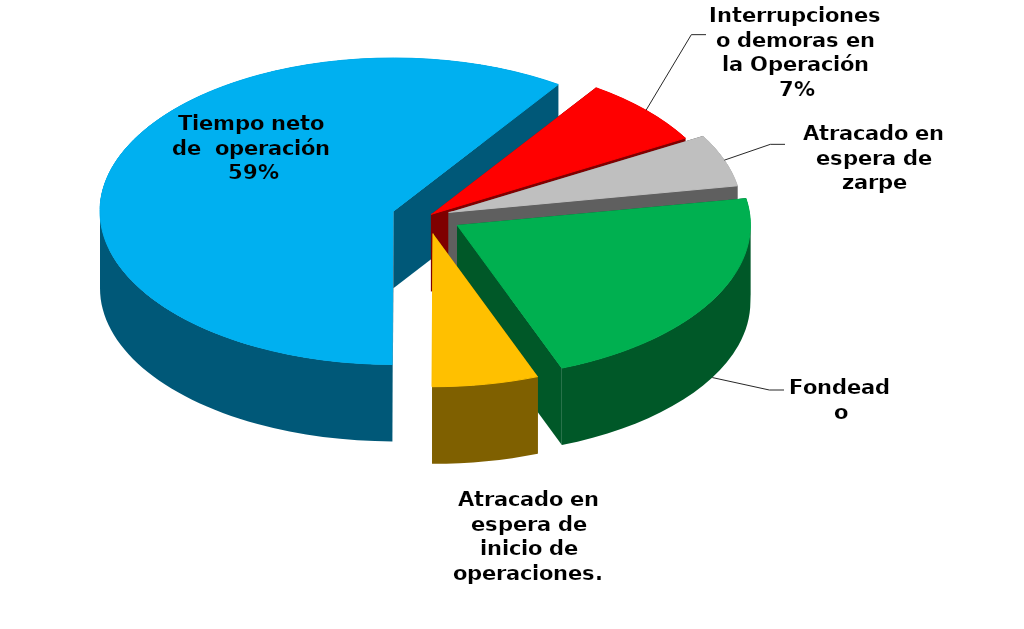
| Category | Series 0 |
|---|---|
| Fondeado | 11767.863 |
| Atracado en espera de inicio de operaciones. | 3142.942 |
| Tiempo neto de  operación | 31850.598 |
| Interrupciones o demoras en la Operación | 3860.78 |
| Atracado en espera de zarpe | 2957.06 |